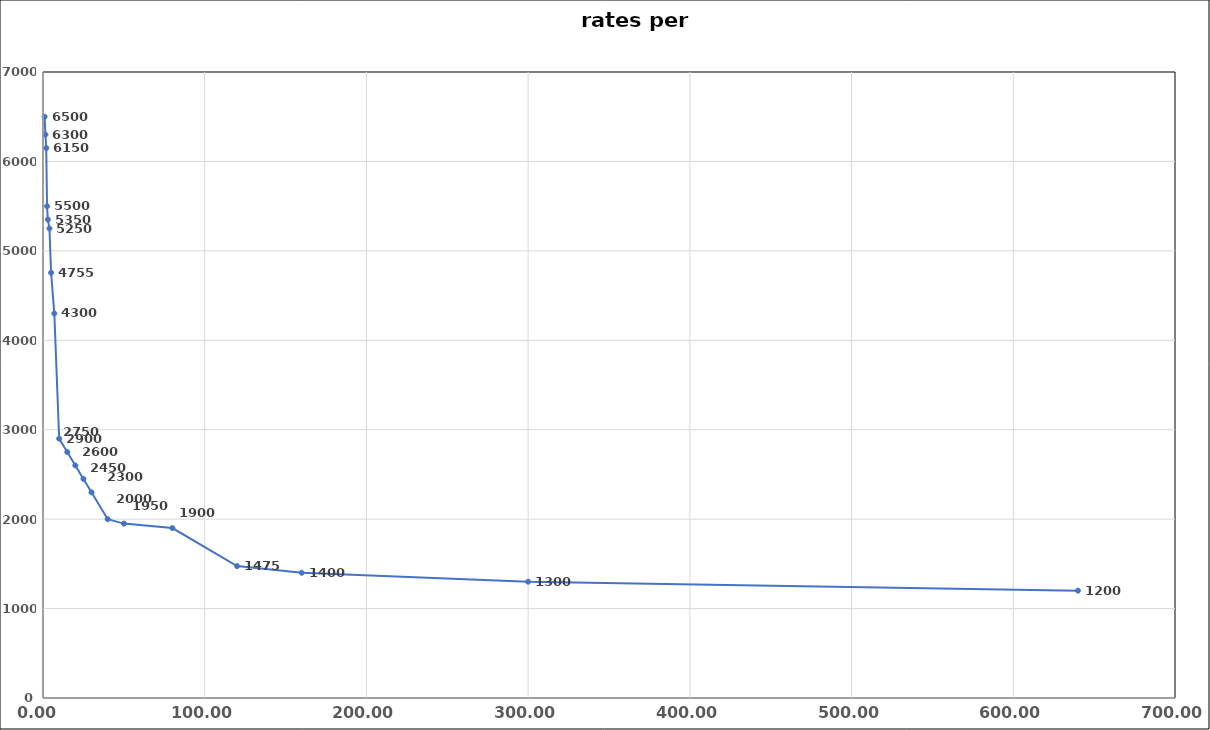
| Category | Series 0 |
|---|---|
| 1.0 | 6500 |
| 1.5 | 6300 |
| 2.0 | 6150 |
| 2.5 | 5500 |
| 3.0 | 5350 |
| 4.0 | 5250 |
| 5.0 | 4755 |
| 7.0 | 4300 |
| 10.0 | 2900 |
| 15.0 | 2750 |
| 20.0 | 2600 |
| 25.0 | 2450 |
| 30.0 | 2300 |
| 40.0 | 2000 |
| 50.0 | 1950 |
| 80.0 | 1900 |
| 120.0 | 1475 |
| 160.0 | 1400 |
| 300.0 | 1300 |
| 640.0 | 1200 |